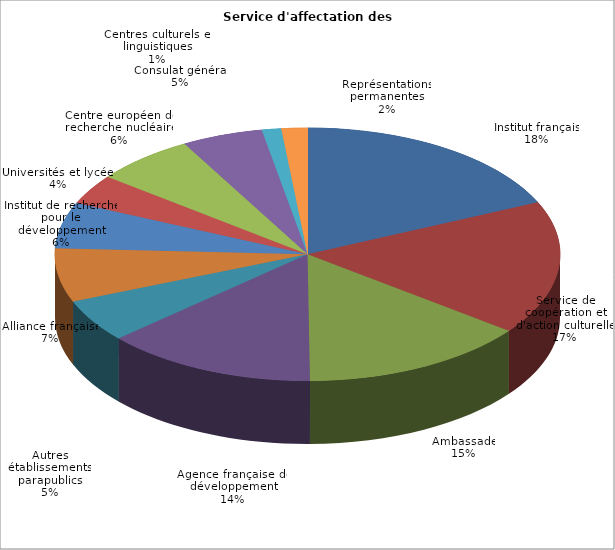
| Category | Nombre de volontaires | % |
|---|---|---|
| Institut français | 176 | 0.182 |
| Service de coopération et d'action culturelle | 165 | 0.171 |
| Ambassade | 140 | 0.145 |
| Agence française de développement | 131 | 0.136 |
| Autres établissements parapublics | 53 | 0.055 |
| Alliance française | 66 | 0.068 |
| Institut de recherche pour le développement | 57 | 0.059 |
| Universités et lycées | 37 | 0.038 |
| Centre européen de recherche nucléaire | 62 | 0.064 |
| Consulat général | 50 | 0.052 |
| Centres culturels et linguistiques | 12 | 0.012 |
| Représentations permanentes | 16 | 0.017 |